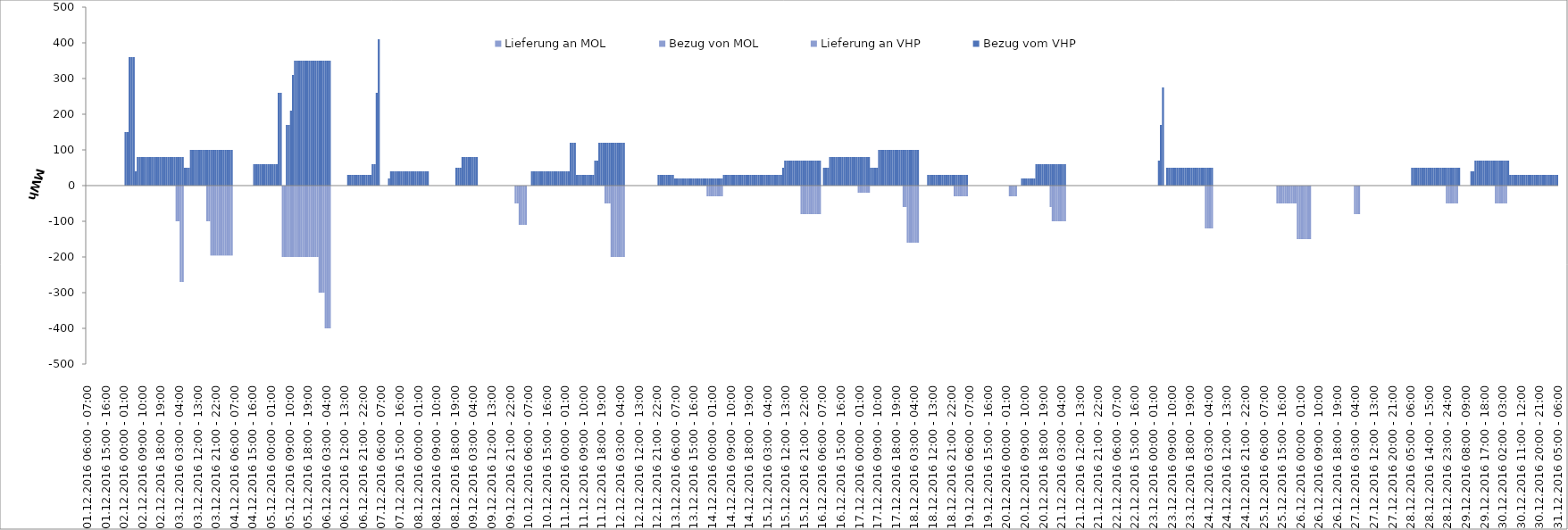
| Category | Bezug vom VHP | Lieferung an VHP | Bezug von MOL | Lieferung an MOL |
|---|---|---|---|---|
| 01.12.2016 06:00 - 07:00 | 0 | 0 | 0 | 0 |
| 01.12.2016 07:00 - 08:00 | 0 | 0 | 0 | 0 |
| 01.12.2016 08:00 - 09:00 | 0 | 0 | 0 | 0 |
| 01.12.2016 09:00 - 10:00 | 0 | 0 | 0 | 0 |
| 01.12.2016 10:00 - 11:00 | 0 | 0 | 0 | 0 |
| 01.12.2016 11:00 - 12:00 | 0 | 0 | 0 | 0 |
| 01.12.2016 12:00 - 13:00 | 0 | 0 | 0 | 0 |
| 01.12.2016 13:00 - 14:00 | 0 | 0 | 0 | 0 |
| 01.12.2016 14:00 - 15:00 | 0 | 0 | 0 | 0 |
| 01.12.2016 15:00 - 16:00 | 0 | 0 | 0 | 0 |
| 01.12.2016 16:00 - 17:00 | 0 | 0 | 0 | 0 |
| 01.12.2016 17:00 - 18:00 | 0 | 0 | 0 | 0 |
| 01.12.2016 18:00 - 19:00 | 0 | 0 | 0 | 0 |
| 01.12.2016 19:00 - 20:00 | 0 | 0 | 0 | 0 |
| 01.12.2016 20:00 - 21:00 | 0 | 0 | 0 | 0 |
| 01.12.2016 21:00 - 22:00 | 0 | 0 | 0 | 0 |
| 01.12.2016 22:00 - 23:00 | 0 | 0 | 0 | 0 |
| 01.12.2016 23:00 - 24:00 | 0 | 0 | 0 | 0 |
| 02.12.2016 00:00 - 01:00 | 0 | 0 | 0 | 0 |
| 02.12.2016 01:00 - 02:00 | 150 | 0 | 0 | 0 |
| 02.12.2016 02:00 - 03:00 | 150 | 0 | 0 | 0 |
| 02.12.2016 03:00 - 04:00 | 360 | 0 | 0 | 0 |
| 02.12.2016 04:00 - 05:00 | 360 | 0 | 0 | 0 |
| 02.12.2016 05:00 - 06:00 | 360 | 0 | 0 | 0 |
| 02.12.2016 06:00 - 07:00 | 40 | 0 | 0 | 0 |
| 02.12.2016 07:00 - 08:00 | 80 | 0 | 0 | 0 |
| 02.12.2016 08:00 - 09:00 | 80 | 0 | 0 | 0 |
| 02.12.2016 09:00 - 10:00 | 80 | 0 | 0 | 0 |
| 02.12.2016 10:00 - 11:00 | 80 | 0 | 0 | 0 |
| 02.12.2016 11:00 - 12:00 | 80 | 0 | 0 | 0 |
| 02.12.2016 12:00 - 13:00 | 80 | 0 | 0 | 0 |
| 02.12.2016 13:00 - 14:00 | 80 | 0 | 0 | 0 |
| 02.12.2016 14:00 - 15:00 | 80 | 0 | 0 | 0 |
| 02.12.2016 15:00 - 16:00 | 80 | 0 | 0 | 0 |
| 02.12.2016 16:00 - 17:00 | 80 | 0 | 0 | 0 |
| 02.12.2016 17:00 - 18:00 | 80 | 0 | 0 | 0 |
| 02.12.2016 18:00 - 19:00 | 80 | 0 | 0 | 0 |
| 02.12.2016 19:00 - 20:00 | 80 | 0 | 0 | 0 |
| 02.12.2016 20:00 - 21:00 | 80 | 0 | 0 | 0 |
| 02.12.2016 21:00 - 22:00 | 80 | 0 | 0 | 0 |
| 02.12.2016 22:00 - 23:00 | 80 | 0 | 0 | 0 |
| 02.12.2016 23:00 - 24:00 | 80 | 0 | 0 | 0 |
| 03.12.2016 00:00 - 01:00 | 80 | 0 | 0 | 0 |
| 03.12.2016 01:00 - 02:00 | 80 | 0 | 0 | 0 |
| 03.12.2016 02:00 - 03:00 | 80 | -100 | 0 | 0 |
| 03.12.2016 03:00 - 04:00 | 80 | -100 | 0 | 0 |
| 03.12.2016 04:00 - 05:00 | 80 | -270 | 0 | 0 |
| 03.12.2016 05:00 - 06:00 | 80 | -270 | 0 | 0 |
| 03.12.2016 06:00 - 07:00 | 50 | 0 | 0 | 0 |
| 03.12.2016 07:00 - 08:00 | 50 | 0 | 0 | 0 |
| 03.12.2016 08:00 - 09:00 | 50 | 0 | 0 | 0 |
| 03.12.2016 09:00 - 10:00 | 100 | 0 | 0 | 0 |
| 03.12.2016 10:00 - 11:00 | 100 | 0 | 0 | 0 |
| 03.12.2016 11:00 - 12:00 | 100 | 0 | 0 | 0 |
| 03.12.2016 12:00 - 13:00 | 100 | 0 | 0 | 0 |
| 03.12.2016 13:00 - 14:00 | 100 | 0 | 0 | 0 |
| 03.12.2016 14:00 - 15:00 | 100 | 0 | 0 | 0 |
| 03.12.2016 15:00 - 16:00 | 100 | 0 | 0 | 0 |
| 03.12.2016 16:00 - 17:00 | 100 | 0 | 0 | 0 |
| 03.12.2016 17:00 - 18:00 | 100 | -100 | 0 | 0 |
| 03.12.2016 18:00 - 19:00 | 100 | -100 | 0 | 0 |
| 03.12.2016 19:00 - 20:00 | 100 | -196 | 0 | 0 |
| 03.12.2016 20:00 - 21:00 | 100 | -196 | 0 | 0 |
| 03.12.2016 21:00 - 22:00 | 100 | -196 | 0 | 0 |
| 03.12.2016 22:00 - 23:00 | 100 | -196 | 0 | 0 |
| 03.12.2016 23:00 - 24:00 | 100 | -196 | 0 | 0 |
| 04.12.2016 00:00 - 01:00 | 100 | -196 | 0 | 0 |
| 04.12.2016 01:00 - 02:00 | 100 | -196 | 0 | 0 |
| 04.12.2016 02:00 - 03:00 | 100 | -196 | 0 | 0 |
| 04.12.2016 03:00 - 04:00 | 100 | -196 | 0 | 0 |
| 04.12.2016 04:00 - 05:00 | 100 | -196 | 0 | 0 |
| 04.12.2016 05:00 - 06:00 | 100 | -196 | 0 | 0 |
| 04.12.2016 06:00 - 07:00 | 0 | 0 | 0 | 0 |
| 04.12.2016 07:00 - 08:00 | 0 | 0 | 0 | 0 |
| 04.12.2016 08:00 - 09:00 | 0 | 0 | 0 | 0 |
| 04.12.2016 09:00 - 10:00 | 0 | 0 | 0 | 0 |
| 04.12.2016 10:00 - 11:00 | 0 | 0 | 0 | 0 |
| 04.12.2016 11:00 - 12:00 | 0 | 0 | 0 | 0 |
| 04.12.2016 12:00 - 13:00 | 0 | 0 | 0 | 0 |
| 04.12.2016 13:00 - 14:00 | 0 | 0 | 0 | 0 |
| 04.12.2016 14:00 - 15:00 | 0 | 0 | 0 | 0 |
| 04.12.2016 15:00 - 16:00 | 0 | 0 | 0 | 0 |
| 04.12.2016 16:00 - 17:00 | 60 | 0 | 0 | 0 |
| 04.12.2016 17:00 - 18:00 | 60 | 0 | 0 | 0 |
| 04.12.2016 18:00 - 19:00 | 60 | 0 | 0 | 0 |
| 04.12.2016 19:00 - 20:00 | 60 | 0 | 0 | 0 |
| 04.12.2016 20:00 - 21:00 | 60 | 0 | 0 | 0 |
| 04.12.2016 21:00 - 22:00 | 60 | 0 | 0 | 0 |
| 04.12.2016 22:00 - 23:00 | 60 | 0 | 0 | 0 |
| 04.12.2016 23:00 - 24:00 | 60 | 0 | 0 | 0 |
| 05.12.2016 00:00 - 01:00 | 60 | 0 | 0 | 0 |
| 05.12.2016 01:00 - 02:00 | 60 | 0 | 0 | 0 |
| 05.12.2016 02:00 - 03:00 | 60 | 0 | 0 | 0 |
| 05.12.2016 03:00 - 04:00 | 60 | 0 | 0 | 0 |
| 05.12.2016 04:00 - 05:00 | 260 | 0 | 0 | 0 |
| 05.12.2016 05:00 - 06:00 | 260 | 0 | 0 | 0 |
| 05.12.2016 06:00 - 07:00 | 0 | -200 | 0 | 0 |
| 05.12.2016 07:00 - 08:00 | 0 | -200 | 0 | 0 |
| 05.12.2016 08:00 - 09:00 | 170 | -200 | 0 | 0 |
| 05.12.2016 09:00 - 10:00 | 170 | -200 | 0 | 0 |
| 05.12.2016 10:00 - 11:00 | 210 | -200 | 0 | 0 |
| 05.12.2016 11:00 - 12:00 | 310 | -200 | 0 | 0 |
| 05.12.2016 12:00 - 13:00 | 350 | -200 | 0 | 0 |
| 05.12.2016 13:00 - 14:00 | 350 | -200 | 0 | 0 |
| 05.12.2016 14:00 - 15:00 | 350 | -200 | 0 | 0 |
| 05.12.2016 15:00 - 16:00 | 350 | -200 | 0 | 0 |
| 05.12.2016 16:00 - 17:00 | 350 | -200 | 0 | 0 |
| 05.12.2016 17:00 - 18:00 | 350 | -200 | 0 | 0 |
| 05.12.2016 18:00 - 19:00 | 350 | -200 | 0 | 0 |
| 05.12.2016 19:00 - 20:00 | 350 | -200 | 0 | 0 |
| 05.12.2016 20:00 - 21:00 | 350 | -200 | 0 | 0 |
| 05.12.2016 21:00 - 22:00 | 350 | -200 | 0 | 0 |
| 05.12.2016 22:00 - 23:00 | 350 | -200 | 0 | 0 |
| 05.12.2016 23:00 - 24:00 | 350 | -200 | 0 | 0 |
| 06.12.2016 00:00 - 01:00 | 350 | -300 | 0 | 0 |
| 06.12.2016 01:00 - 02:00 | 350 | -300 | 0 | 0 |
| 06.12.2016 02:00 - 03:00 | 350 | -300 | 0 | 0 |
| 06.12.2016 03:00 - 04:00 | 350 | -400 | 0 | 0 |
| 06.12.2016 04:00 - 05:00 | 350 | -400 | 0 | 0 |
| 06.12.2016 05:00 - 06:00 | 350 | -400 | 0 | 0 |
| 06.12.2016 06:00 - 07:00 | 0 | 0 | 0 | 0 |
| 06.12.2016 07:00 - 08:00 | 0 | 0 | 0 | 0 |
| 06.12.2016 08:00 - 09:00 | 0 | 0 | 0 | 0 |
| 06.12.2016 09:00 - 10:00 | 0 | 0 | 0 | 0 |
| 06.12.2016 10:00 - 11:00 | 0 | 0 | 0 | 0 |
| 06.12.2016 11:00 - 12:00 | 0 | 0 | 0 | 0 |
| 06.12.2016 12:00 - 13:00 | 0 | 0 | 0 | 0 |
| 06.12.2016 13:00 - 14:00 | 0 | 0 | 0 | 0 |
| 06.12.2016 14:00 - 15:00 | 30 | 0 | 0 | 0 |
| 06.12.2016 15:00 - 16:00 | 30 | 0 | 0 | 0 |
| 06.12.2016 16:00 - 17:00 | 30 | 0 | 0 | 0 |
| 06.12.2016 17:00 - 18:00 | 30 | 0 | 0 | 0 |
| 06.12.2016 18:00 - 19:00 | 30 | 0 | 0 | 0 |
| 06.12.2016 19:00 - 20:00 | 30 | 0 | 0 | 0 |
| 06.12.2016 20:00 - 21:00 | 30 | 0 | 0 | 0 |
| 06.12.2016 21:00 - 22:00 | 30 | 0 | 0 | 0 |
| 06.12.2016 22:00 - 23:00 | 30 | 0 | 0 | 0 |
| 06.12.2016 23:00 - 24:00 | 30 | 0 | 0 | 0 |
| 07.12.2016 00:00 - 01:00 | 30 | 0 | 0 | 0 |
| 07.12.2016 01:00 - 02:00 | 30 | 0 | 0 | 0 |
| 07.12.2016 02:00 - 03:00 | 60 | 0 | 0 | 0 |
| 07.12.2016 03:00 - 04:00 | 60 | 0 | 0 | 0 |
| 07.12.2016 04:00 - 05:00 | 260 | 0 | 0 | 0 |
| 07.12.2016 05:00 - 06:00 | 410 | 0 | 0 | 0 |
| 07.12.2016 06:00 - 07:00 | 0 | 0 | 0 | 0 |
| 07.12.2016 07:00 - 08:00 | 0 | 0 | 0 | 0 |
| 07.12.2016 08:00 - 09:00 | 0 | 0 | 0 | 0 |
| 07.12.2016 09:00 - 10:00 | 0 | 0 | 0 | 0 |
| 07.12.2016 10:00 - 11:00 | 20 | 0 | 0 | 0 |
| 07.12.2016 11:00 - 12:00 | 40 | 0 | 0 | 0 |
| 07.12.2016 12:00 - 13:00 | 40 | 0 | 0 | 0 |
| 07.12.2016 13:00 - 14:00 | 40 | 0 | 0 | 0 |
| 07.12.2016 14:00 - 15:00 | 40 | 0 | 0 | 0 |
| 07.12.2016 15:00 - 16:00 | 40 | 0 | 0 | 0 |
| 07.12.2016 16:00 - 17:00 | 40 | 0 | 0 | 0 |
| 07.12.2016 17:00 - 18:00 | 40 | 0 | 0 | 0 |
| 07.12.2016 18:00 - 19:00 | 40 | 0 | 0 | 0 |
| 07.12.2016 19:00 - 20:00 | 40 | 0 | 0 | 0 |
| 07.12.2016 20:00 - 21:00 | 40 | 0 | 0 | 0 |
| 07.12.2016 21:00 - 22:00 | 40 | 0 | 0 | 0 |
| 07.12.2016 22:00 - 23:00 | 40 | 0 | 0 | 0 |
| 07.12.2016 23:00 - 24:00 | 40 | 0 | 0 | 0 |
| 08.12.2016 00:00 - 01:00 | 40 | 0 | 0 | 0 |
| 08.12.2016 01:00 - 02:00 | 40 | 0 | 0 | 0 |
| 08.12.2016 02:00 - 03:00 | 40 | 0 | 0 | 0 |
| 08.12.2016 03:00 - 04:00 | 40 | 0 | 0 | 0 |
| 08.12.2016 04:00 - 05:00 | 40 | 0 | 0 | 0 |
| 08.12.2016 05:00 - 06:00 | 40 | 0 | 0 | 0 |
| 08.12.2016 06:00 - 07:00 | 0 | 0 | 0 | 0 |
| 08.12.2016 07:00 - 08:00 | 0 | 0 | 0 | 0 |
| 08.12.2016 08:00 - 09:00 | 0 | 0 | 0 | 0 |
| 08.12.2016 09:00 - 10:00 | 0 | 0 | 0 | 0 |
| 08.12.2016 10:00 - 11:00 | 0 | 0 | 0 | 0 |
| 08.12.2016 11:00 - 12:00 | 0 | 0 | 0 | 0 |
| 08.12.2016 12:00 - 13:00 | 0 | 0 | 0 | 0 |
| 08.12.2016 13:00 - 14:00 | 0 | 0 | 0 | 0 |
| 08.12.2016 14:00 - 15:00 | 0 | 0 | 0 | 0 |
| 08.12.2016 15:00 - 16:00 | 0 | 0 | 0 | 0 |
| 08.12.2016 16:00 - 17:00 | 0 | 0 | 0 | 0 |
| 08.12.2016 17:00 - 18:00 | 0 | 0 | 0 | 0 |
| 08.12.2016 18:00 - 19:00 | 0 | 0 | 0 | 0 |
| 08.12.2016 19:00 - 20:00 | 50 | 0 | 0 | 0 |
| 08.12.2016 20:00 - 21:00 | 50 | 0 | 0 | 0 |
| 08.12.2016 21:00 - 22:00 | 50 | 0 | 0 | 0 |
| 08.12.2016 22:00 - 23:00 | 80 | 0 | 0 | 0 |
| 08.12.2016 23:00 - 24:00 | 80 | 0 | 0 | 0 |
| 09.12.2016 00:00 - 01:00 | 80 | 0 | 0 | 0 |
| 09.12.2016 01:00 - 02:00 | 80 | 0 | 0 | 0 |
| 09.12.2016 02:00 - 03:00 | 80 | 0 | 0 | 0 |
| 09.12.2016 03:00 - 04:00 | 80 | 0 | 0 | 0 |
| 09.12.2016 04:00 - 05:00 | 80 | 0 | 0 | 0 |
| 09.12.2016 05:00 - 06:00 | 80 | 0 | 0 | 0 |
| 09.12.2016 06:00 - 07:00 | 0 | 0 | 0 | 0 |
| 09.12.2016 07:00 - 08:00 | 0 | 0 | 0 | 0 |
| 09.12.2016 08:00 - 09:00 | 0 | 0 | 0 | 0 |
| 09.12.2016 09:00 - 10:00 | 0 | 0 | 0 | 0 |
| 09.12.2016 10:00 - 11:00 | 0 | 0 | 0 | 0 |
| 09.12.2016 11:00 - 12:00 | 0 | 0 | 0 | 0 |
| 09.12.2016 12:00 - 13:00 | 0 | 0 | 0 | 0 |
| 09.12.2016 13:00 - 14:00 | 0 | 0 | 0 | 0 |
| 09.12.2016 14:00 - 15:00 | 0 | 0 | 0 | 0 |
| 09.12.2016 15:00 - 16:00 | 0 | 0 | 0 | 0 |
| 09.12.2016 16:00 - 17:00 | 0 | 0 | 0 | 0 |
| 09.12.2016 17:00 - 18:00 | 0 | 0 | 0 | 0 |
| 09.12.2016 18:00 - 19:00 | 0 | 0 | 0 | 0 |
| 09.12.2016 19:00 - 20:00 | 0 | 0 | 0 | 0 |
| 09.12.2016 20:00 - 21:00 | 0 | 0 | 0 | 0 |
| 09.12.2016 21:00 - 22:00 | 0 | 0 | 0 | 0 |
| 09.12.2016 22:00 - 23:00 | 0 | 0 | 0 | 0 |
| 09.12.2016 23:00 - 24:00 | 0 | 0 | 0 | 0 |
| 10.12.2016 00:00 - 01:00 | 0 | -50 | 0 | 0 |
| 10.12.2016 01:00 - 02:00 | 0 | -50 | 0 | 0 |
| 10.12.2016 02:00 - 03:00 | 0 | -110 | 0 | 0 |
| 10.12.2016 03:00 - 04:00 | 0 | -110 | 0 | 0 |
| 10.12.2016 04:00 - 05:00 | 0 | -110 | 0 | 0 |
| 10.12.2016 05:00 - 06:00 | 0 | -110 | 0 | 0 |
| 10.12.2016 06:00 - 07:00 | 0 | 0 | 0 | 0 |
| 10.12.2016 07:00 - 08:00 | 0 | 0 | 0 | 0 |
| 10.12.2016 08:00 - 09:00 | 40 | 0 | 0 | 0 |
| 10.12.2016 09:00 - 10:00 | 40 | 0 | 0 | 0 |
| 10.12.2016 10:00 - 11:00 | 40 | 0 | 0 | 0 |
| 10.12.2016 11:00 - 12:00 | 40 | 0 | 0 | 0 |
| 10.12.2016 12:00 - 13:00 | 40 | 0 | 0 | 0 |
| 10.12.2016 13:00 - 14:00 | 40 | 0 | 0 | 0 |
| 10.12.2016 14:00 - 15:00 | 40 | 0 | 0 | 0 |
| 10.12.2016 15:00 - 16:00 | 40 | 0 | 0 | 0 |
| 10.12.2016 16:00 - 17:00 | 40 | 0 | 0 | 0 |
| 10.12.2016 17:00 - 18:00 | 40 | 0 | 0 | 0 |
| 10.12.2016 18:00 - 19:00 | 40 | 0 | 0 | 0 |
| 10.12.2016 19:00 - 20:00 | 40 | 0 | 0 | 0 |
| 10.12.2016 20:00 - 21:00 | 40 | 0 | 0 | 0 |
| 10.12.2016 21:00 - 22:00 | 40 | 0 | 0 | 0 |
| 10.12.2016 22:00 - 23:00 | 40 | 0 | 0 | 0 |
| 10.12.2016 23:00 - 24:00 | 40 | 0 | 0 | 0 |
| 11.12.2016 00:00 - 01:00 | 40 | 0 | 0 | 0 |
| 11.12.2016 01:00 - 02:00 | 40 | 0 | 0 | 0 |
| 11.12.2016 02:00 - 03:00 | 40 | 0 | 0 | 0 |
| 11.12.2016 03:00 - 04:00 | 120 | 0 | 0 | 0 |
| 11.12.2016 04:00 - 05:00 | 120 | 0 | 0 | 0 |
| 11.12.2016 05:00 - 06:00 | 120 | 0 | 0 | 0 |
| 11.12.2016 06:00 - 07:00 | 30 | 0 | 0 | 0 |
| 11.12.2016 07:00 - 08:00 | 30 | 0 | 0 | 0 |
| 11.12.2016 08:00 - 09:00 | 30 | 0 | 0 | 0 |
| 11.12.2016 09:00 - 10:00 | 30 | 0 | 0 | 0 |
| 11.12.2016 10:00 - 11:00 | 30 | 0 | 0 | 0 |
| 11.12.2016 11:00 - 12:00 | 30 | 0 | 0 | 0 |
| 11.12.2016 12:00 - 13:00 | 30 | 0 | 0 | 0 |
| 11.12.2016 13:00 - 14:00 | 30 | 0 | 0 | 0 |
| 11.12.2016 14:00 - 15:00 | 30 | 0 | 0 | 0 |
| 11.12.2016 15:00 - 16:00 | 70 | 0 | 0 | 0 |
| 11.12.2016 16:00 - 17:00 | 70 | 0 | 0 | 0 |
| 11.12.2016 17:00 - 18:00 | 120 | 0 | 0 | 0 |
| 11.12.2016 18:00 - 19:00 | 120 | 0 | 0 | 0 |
| 11.12.2016 19:00 - 20:00 | 120 | 0 | 0 | 0 |
| 11.12.2016 20:00 - 21:00 | 120 | -50 | 0 | 0 |
| 11.12.2016 21:00 - 22:00 | 120 | -50 | 0 | 0 |
| 11.12.2016 22:00 - 23:00 | 120 | -50 | 0 | 0 |
| 11.12.2016 23:00 - 24:00 | 120 | -200 | 0 | 0 |
| 12.12.2016 00:00 - 01:00 | 120 | -200 | 0 | 0 |
| 12.12.2016 01:00 - 02:00 | 120 | -200 | 0 | 0 |
| 12.12.2016 02:00 - 03:00 | 120 | -200 | 0 | 0 |
| 12.12.2016 03:00 - 04:00 | 120 | -200 | 0 | 0 |
| 12.12.2016 04:00 - 05:00 | 120 | -200 | 0 | 0 |
| 12.12.2016 05:00 - 06:00 | 120 | -200 | 0 | 0 |
| 12.12.2016 06:00 - 07:00 | 0 | 0 | 0 | 0 |
| 12.12.2016 07:00 - 08:00 | 0 | 0 | 0 | 0 |
| 12.12.2016 08:00 - 09:00 | 0 | 0 | 0 | 0 |
| 12.12.2016 09:00 - 10:00 | 0 | 0 | 0 | 0 |
| 12.12.2016 10:00 - 11:00 | 0 | 0 | 0 | 0 |
| 12.12.2016 11:00 - 12:00 | 0 | 0 | 0 | 0 |
| 12.12.2016 12:00 - 13:00 | 0 | 0 | 0 | 0 |
| 12.12.2016 13:00 - 14:00 | 0 | 0 | 0 | 0 |
| 12.12.2016 14:00 - 15:00 | 0 | 0 | 0 | 0 |
| 12.12.2016 15:00 - 16:00 | 0 | 0 | 0 | 0 |
| 12.12.2016 16:00 - 17:00 | 0 | 0 | 0 | 0 |
| 12.12.2016 17:00 - 18:00 | 0 | 0 | 0 | 0 |
| 12.12.2016 18:00 - 19:00 | 0 | 0 | 0 | 0 |
| 12.12.2016 19:00 - 20:00 | 0 | 0 | 0 | 0 |
| 12.12.2016 20:00 - 21:00 | 0 | 0 | 0 | 0 |
| 12.12.2016 21:00 - 22:00 | 0 | 0 | 0 | 0 |
| 12.12.2016 22:00 - 23:00 | 30 | 0 | 0 | 0 |
| 12.12.2016 23:00 - 24:00 | 30 | 0 | 0 | 0 |
| 13.12.2016 00:00 - 01:00 | 30 | 0 | 0 | 0 |
| 13.12.2016 01:00 - 02:00 | 30 | 0 | 0 | 0 |
| 13.12.2016 02:00 - 03:00 | 30 | 0 | 0 | 0 |
| 13.12.2016 03:00 - 04:00 | 30 | 0 | 0 | 0 |
| 13.12.2016 04:00 - 05:00 | 30 | 0 | 0 | 0 |
| 13.12.2016 05:00 - 06:00 | 30 | 0 | 0 | 0 |
| 13.12.2016 06:00 - 07:00 | 20 | 0 | 0 | 0 |
| 13.12.2016 07:00 - 08:00 | 20 | 0 | 0 | 0 |
| 13.12.2016 08:00 - 09:00 | 20 | 0 | 0 | 0 |
| 13.12.2016 09:00 - 10:00 | 20 | 0 | 0 | 0 |
| 13.12.2016 10:00 - 11:00 | 20 | 0 | 0 | 0 |
| 13.12.2016 11:00 - 12:00 | 20 | 0 | 0 | 0 |
| 13.12.2016 12:00 - 13:00 | 20 | 0 | 0 | 0 |
| 13.12.2016 13:00 - 14:00 | 20 | 0 | 0 | 0 |
| 13.12.2016 14:00 - 15:00 | 20 | 0 | 0 | 0 |
| 13.12.2016 15:00 - 16:00 | 20 | 0 | 0 | 0 |
| 13.12.2016 16:00 - 17:00 | 20 | 0 | 0 | 0 |
| 13.12.2016 17:00 - 18:00 | 20 | 0 | 0 | 0 |
| 13.12.2016 18:00 - 19:00 | 20 | 0 | 0 | 0 |
| 13.12.2016 19:00 - 20:00 | 20 | 0 | 0 | 0 |
| 13.12.2016 20:00 - 21:00 | 20 | 0 | 0 | 0 |
| 13.12.2016 21:00 - 22:00 | 20 | 0 | 0 | 0 |
| 13.12.2016 22:00 - 23:00 | 20 | -30 | 0 | 0 |
| 13.12.2016 23:00 - 24:00 | 20 | -30 | 0 | 0 |
| 14.12.2016 00:00 - 01:00 | 20 | -30 | 0 | 0 |
| 14.12.2016 01:00 - 02:00 | 20 | -30 | 0 | 0 |
| 14.12.2016 02:00 - 03:00 | 20 | -30 | 0 | 0 |
| 14.12.2016 03:00 - 04:00 | 20 | -30 | 0 | 0 |
| 14.12.2016 04:00 - 05:00 | 20 | -30 | 0 | 0 |
| 14.12.2016 05:00 - 06:00 | 20 | -30 | 0 | 0 |
| 14.12.2016 06:00 - 07:00 | 30 | 0 | 0 | 0 |
| 14.12.2016 07:00 - 08:00 | 30 | 0 | 0 | 0 |
| 14.12.2016 08:00 - 09:00 | 30 | 0 | 0 | 0 |
| 14.12.2016 09:00 - 10:00 | 30 | 0 | 0 | 0 |
| 14.12.2016 10:00 - 11:00 | 30 | 0 | 0 | 0 |
| 14.12.2016 11:00 - 12:00 | 30 | 0 | 0 | 0 |
| 14.12.2016 12:00 - 13:00 | 30 | 0 | 0 | 0 |
| 14.12.2016 13:00 - 14:00 | 30 | 0 | 0 | 0 |
| 14.12.2016 14:00 - 15:00 | 30 | 0 | 0 | 0 |
| 14.12.2016 15:00 - 16:00 | 30 | 0 | 0 | 0 |
| 14.12.2016 16:00 - 17:00 | 30 | 0 | 0 | 0 |
| 14.12.2016 17:00 - 18:00 | 30 | 0 | 0 | 0 |
| 14.12.2016 18:00 - 19:00 | 30 | 0 | 0 | 0 |
| 14.12.2016 19:00 - 20:00 | 30 | 0 | 0 | 0 |
| 14.12.2016 20:00 - 21:00 | 30 | 0 | 0 | 0 |
| 14.12.2016 21:00 - 22:00 | 30 | 0 | 0 | 0 |
| 14.12.2016 22:00 - 23:00 | 30 | 0 | 0 | 0 |
| 14.12.2016 23:00 - 24:00 | 30 | 0 | 0 | 0 |
| 15.12.2016 00:00 - 01:00 | 30 | 0 | 0 | 0 |
| 15.12.2016 01:00 - 02:00 | 30 | 0 | 0 | 0 |
| 15.12.2016 02:00 - 03:00 | 30 | 0 | 0 | 0 |
| 15.12.2016 03:00 - 04:00 | 30 | 0 | 0 | 0 |
| 15.12.2016 04:00 - 05:00 | 30 | 0 | 0 | 0 |
| 15.12.2016 05:00 - 06:00 | 30 | 0 | 0 | 0 |
| 15.12.2016 06:00 - 07:00 | 30 | 0 | 0 | 0 |
| 15.12.2016 07:00 - 08:00 | 30 | 0 | 0 | 0 |
| 15.12.2016 08:00 - 09:00 | 30 | 0 | 0 | 0 |
| 15.12.2016 09:00 - 10:00 | 30 | 0 | 0 | 0 |
| 15.12.2016 10:00 - 11:00 | 30 | 0 | 0 | 0 |
| 15.12.2016 11:00 - 12:00 | 50 | 0 | 0 | 0 |
| 15.12.2016 12:00 - 13:00 | 70 | 0 | 0 | 0 |
| 15.12.2016 13:00 - 14:00 | 70 | 0 | 0 | 0 |
| 15.12.2016 14:00 - 15:00 | 70 | 0 | 0 | 0 |
| 15.12.2016 15:00 - 16:00 | 70 | 0 | 0 | 0 |
| 15.12.2016 16:00 - 17:00 | 70 | 0 | 0 | 0 |
| 15.12.2016 17:00 - 18:00 | 70 | 0 | 0 | 0 |
| 15.12.2016 18:00 - 19:00 | 70 | 0 | 0 | 0 |
| 15.12.2016 19:00 - 20:00 | 70 | 0 | 0 | 0 |
| 15.12.2016 20:00 - 21:00 | 70 | -80 | 0 | 0 |
| 15.12.2016 21:00 - 22:00 | 70 | -80 | 0 | 0 |
| 15.12.2016 22:00 - 23:00 | 70 | -80 | 0 | 0 |
| 15.12.2016 23:00 - 24:00 | 70 | -80 | 0 | 0 |
| 16.12.2016 00:00 - 01:00 | 70 | -80 | 0 | 0 |
| 16.12.2016 01:00 - 02:00 | 70 | -80 | 0 | 0 |
| 16.12.2016 02:00 - 03:00 | 70 | -80 | 0 | 0 |
| 16.12.2016 03:00 - 04:00 | 70 | -80 | 0 | 0 |
| 16.12.2016 04:00 - 05:00 | 70 | -80 | 0 | 0 |
| 16.12.2016 05:00 - 06:00 | 70 | -80 | 0 | 0 |
| 16.12.2016 06:00 - 07:00 | 0 | 0 | 0 | 0 |
| 16.12.2016 07:00 - 08:00 | 50 | 0 | 0 | 0 |
| 16.12.2016 08:00 - 09:00 | 50 | 0 | 0 | 0 |
| 16.12.2016 09:00 - 10:00 | 50 | 0 | 0 | 0 |
| 16.12.2016 10:00 - 11:00 | 80 | 0 | 0 | 0 |
| 16.12.2016 11:00 - 12:00 | 80 | 0 | 0 | 0 |
| 16.12.2016 12:00 - 13:00 | 80 | 0 | 0 | 0 |
| 16.12.2016 13:00 - 14:00 | 80 | 0 | 0 | 0 |
| 16.12.2016 14:00 - 15:00 | 80 | 0 | 0 | 0 |
| 16.12.2016 15:00 - 16:00 | 80 | 0 | 0 | 0 |
| 16.12.2016 16:00 - 17:00 | 80 | 0 | 0 | 0 |
| 16.12.2016 17:00 - 18:00 | 80 | 0 | 0 | 0 |
| 16.12.2016 18:00 - 19:00 | 80 | 0 | 0 | 0 |
| 16.12.2016 19:00 - 20:00 | 80 | 0 | 0 | 0 |
| 16.12.2016 20:00 - 21:00 | 80 | 0 | 0 | 0 |
| 16.12.2016 21:00 - 22:00 | 80 | 0 | 0 | 0 |
| 16.12.2016 22:00 - 23:00 | 80 | 0 | 0 | 0 |
| 16.12.2016 23:00 - 24:00 | 80 | 0 | 0 | 0 |
| 17.12.2016 00:00 - 01:00 | 80 | -20 | 0 | 0 |
| 17.12.2016 01:00 - 02:00 | 80 | -20 | 0 | 0 |
| 17.12.2016 02:00 - 03:00 | 80 | -20 | 0 | 0 |
| 17.12.2016 03:00 - 04:00 | 80 | -20 | 0 | 0 |
| 17.12.2016 04:00 - 05:00 | 80 | -20 | 0 | 0 |
| 17.12.2016 05:00 - 06:00 | 80 | -20 | 0 | 0 |
| 17.12.2016 06:00 - 07:00 | 50 | 0 | 0 | 0 |
| 17.12.2016 07:00 - 08:00 | 50 | 0 | 0 | 0 |
| 17.12.2016 08:00 - 09:00 | 50 | 0 | 0 | 0 |
| 17.12.2016 09:00 - 10:00 | 50 | 0 | 0 | 0 |
| 17.12.2016 10:00 - 11:00 | 100 | 0 | 0 | 0 |
| 17.12.2016 11:00 - 12:00 | 100 | 0 | 0 | 0 |
| 17.12.2016 12:00 - 13:00 | 100 | 0 | 0 | 0 |
| 17.12.2016 13:00 - 14:00 | 100 | 0 | 0 | 0 |
| 17.12.2016 14:00 - 15:00 | 100 | 0 | 0 | 0 |
| 17.12.2016 15:00 - 16:00 | 100 | 0 | 0 | 0 |
| 17.12.2016 16:00 - 17:00 | 100 | 0 | 0 | 0 |
| 17.12.2016 17:00 - 18:00 | 100 | 0 | 0 | 0 |
| 17.12.2016 18:00 - 19:00 | 100 | 0 | 0 | 0 |
| 17.12.2016 19:00 - 20:00 | 100 | 0 | 0 | 0 |
| 17.12.2016 20:00 - 21:00 | 100 | 0 | 0 | 0 |
| 17.12.2016 21:00 - 22:00 | 100 | 0 | 0 | 0 |
| 17.12.2016 22:00 - 23:00 | 100 | -60 | 0 | 0 |
| 17.12.2016 23:00 - 24:00 | 100 | -60 | 0 | 0 |
| 18.12.2016 00:00 - 01:00 | 100 | -160 | 0 | 0 |
| 18.12.2016 01:00 - 02:00 | 100 | -160 | 0 | 0 |
| 18.12.2016 02:00 - 03:00 | 100 | -160 | 0 | 0 |
| 18.12.2016 03:00 - 04:00 | 100 | -160 | 0 | 0 |
| 18.12.2016 04:00 - 05:00 | 100 | -160 | 0 | 0 |
| 18.12.2016 05:00 - 06:00 | 100 | -160 | 0 | 0 |
| 18.12.2016 06:00 - 07:00 | 0 | 0 | 0 | 0 |
| 18.12.2016 07:00 - 08:00 | 0 | 0 | 0 | 0 |
| 18.12.2016 08:00 - 09:00 | 0 | 0 | 0 | 0 |
| 18.12.2016 09:00 - 10:00 | 0 | 0 | 0 | 0 |
| 18.12.2016 10:00 - 11:00 | 30 | 0 | 0 | 0 |
| 18.12.2016 11:00 - 12:00 | 30 | 0 | 0 | 0 |
| 18.12.2016 12:00 - 13:00 | 30 | 0 | 0 | 0 |
| 18.12.2016 13:00 - 14:00 | 30 | 0 | 0 | 0 |
| 18.12.2016 14:00 - 15:00 | 30 | 0 | 0 | 0 |
| 18.12.2016 15:00 - 16:00 | 30 | 0 | 0 | 0 |
| 18.12.2016 16:00 - 17:00 | 30 | 0 | 0 | 0 |
| 18.12.2016 17:00 - 18:00 | 30 | 0 | 0 | 0 |
| 18.12.2016 18:00 - 19:00 | 30 | 0 | 0 | 0 |
| 18.12.2016 19:00 - 20:00 | 30 | 0 | 0 | 0 |
| 18.12.2016 20:00 - 21:00 | 30 | 0 | 0 | 0 |
| 18.12.2016 21:00 - 22:00 | 30 | 0 | 0 | 0 |
| 18.12.2016 22:00 - 23:00 | 30 | 0 | 0 | 0 |
| 18.12.2016 23:00 - 24:00 | 30 | -30 | 0 | 0 |
| 19.12.2016 00:00 - 01:00 | 30 | -30 | 0 | 0 |
| 19.12.2016 01:00 - 02:00 | 30 | -30 | 0 | 0 |
| 19.12.2016 02:00 - 03:00 | 30 | -30 | 0 | 0 |
| 19.12.2016 03:00 - 04:00 | 30 | -30 | 0 | 0 |
| 19.12.2016 04:00 - 05:00 | 30 | -30 | 0 | 0 |
| 19.12.2016 05:00 - 06:00 | 30 | -30 | 0 | 0 |
| 19.12.2016 06:00 - 07:00 | 0 | 0 | 0 | 0 |
| 19.12.2016 07:00 - 08:00 | 0 | 0 | 0 | 0 |
| 19.12.2016 08:00 - 09:00 | 0 | 0 | 0 | 0 |
| 19.12.2016 09:00 - 10:00 | 0 | 0 | 0 | 0 |
| 19.12.2016 10:00 - 11:00 | 0 | 0 | 0 | 0 |
| 19.12.2016 11:00 - 12:00 | 0 | 0 | 0 | 0 |
| 19.12.2016 12:00 - 13:00 | 0 | 0 | 0 | 0 |
| 19.12.2016 13:00 - 14:00 | 0 | 0 | 0 | 0 |
| 19.12.2016 14:00 - 15:00 | 0 | 0 | 0 | 0 |
| 19.12.2016 15:00 - 16:00 | 0 | 0 | 0 | 0 |
| 19.12.2016 16:00 - 17:00 | 0 | 0 | 0 | 0 |
| 19.12.2016 17:00 - 18:00 | 0 | 0 | 0 | 0 |
| 19.12.2016 18:00 - 19:00 | 0 | 0 | 0 | 0 |
| 19.12.2016 19:00 - 20:00 | 0 | 0 | 0 | 0 |
| 19.12.2016 20:00 - 21:00 | 0 | 0 | 0 | 0 |
| 19.12.2016 21:00 - 22:00 | 0 | 0 | 0 | 0 |
| 19.12.2016 22:00 - 23:00 | 0 | 0 | 0 | 0 |
| 19.12.2016 23:00 - 24:00 | 0 | 0 | 0 | 0 |
| 20.12.2016 00:00 - 01:00 | 0 | 0 | 0 | 0 |
| 20.12.2016 01:00 - 02:00 | 0 | 0 | 0 | 0 |
| 20.12.2016 02:00 - 03:00 | 0 | -30 | 0 | 0 |
| 20.12.2016 03:00 - 04:00 | 0 | -30 | 0 | 0 |
| 20.12.2016 04:00 - 05:00 | 0 | -30 | 0 | 0 |
| 20.12.2016 05:00 - 06:00 | 0 | -30 | 0 | 0 |
| 20.12.2016 06:00 - 07:00 | 0 | 0 | 0 | 0 |
| 20.12.2016 07:00 - 08:00 | 0 | 0 | 0 | 0 |
| 20.12.2016 08:00 - 09:00 | 20 | 0 | 0 | 0 |
| 20.12.2016 09:00 - 10:00 | 20 | 0 | 0 | 0 |
| 20.12.2016 10:00 - 11:00 | 20 | 0 | 0 | 0 |
| 20.12.2016 11:00 - 12:00 | 20 | 0 | 0 | 0 |
| 20.12.2016 12:00 - 13:00 | 20 | 0 | 0 | 0 |
| 20.12.2016 13:00 - 14:00 | 20 | 0 | 0 | 0 |
| 20.12.2016 14:00 - 15:00 | 20 | 0 | 0 | 0 |
| 20.12.2016 15:00 - 16:00 | 60 | 0 | 0 | 0 |
| 20.12.2016 16:00 - 17:00 | 60 | 0 | 0 | 0 |
| 20.12.2016 17:00 - 18:00 | 60 | 0 | 0 | 0 |
| 20.12.2016 18:00 - 19:00 | 60 | 0 | 0 | 0 |
| 20.12.2016 19:00 - 20:00 | 60 | 0 | 0 | 0 |
| 20.12.2016 20:00 - 21:00 | 60 | 0 | 0 | 0 |
| 20.12.2016 21:00 - 22:00 | 60 | 0 | 0 | 0 |
| 20.12.2016 22:00 - 23:00 | 60 | -60 | 0 | 0 |
| 20.12.2016 23:00 - 24:00 | 60 | -100 | 0 | 0 |
| 21.12.2016 00:00 - 01:00 | 60 | -100 | 0 | 0 |
| 21.12.2016 01:00 - 02:00 | 60 | -100 | 0 | 0 |
| 21.12.2016 02:00 - 03:00 | 60 | -100 | 0 | 0 |
| 21.12.2016 03:00 - 04:00 | 60 | -100 | 0 | 0 |
| 21.12.2016 04:00 - 05:00 | 60 | -100 | 0 | 0 |
| 21.12.2016 05:00 - 06:00 | 60 | -100 | 0 | 0 |
| 21.12.2016 06:00 - 07:00 | 0 | 0 | 0 | 0 |
| 21.12.2016 07:00 - 08:00 | 0 | 0 | 0 | 0 |
| 21.12.2016 08:00 - 09:00 | 0 | 0 | 0 | 0 |
| 21.12.2016 09:00 - 10:00 | 0 | 0 | 0 | 0 |
| 21.12.2016 10:00 - 11:00 | 0 | 0 | 0 | 0 |
| 21.12.2016 11:00 - 12:00 | 0 | 0 | 0 | 0 |
| 21.12.2016 12:00 - 13:00 | 0 | 0 | 0 | 0 |
| 21.12.2016 13:00 - 14:00 | 0 | 0 | 0 | 0 |
| 21.12.2016 14:00 - 15:00 | 0 | 0 | 0 | 0 |
| 21.12.2016 15:00 - 16:00 | 0 | 0 | 0 | 0 |
| 21.12.2016 16:00 - 17:00 | 0 | 0 | 0 | 0 |
| 21.12.2016 17:00 - 18:00 | 0 | 0 | 0 | 0 |
| 21.12.2016 18:00 - 19:00 | 0 | 0 | 0 | 0 |
| 21.12.2016 19:00 - 20:00 | 0 | 0 | 0 | 0 |
| 21.12.2016 20:00 - 21:00 | 0 | 0 | 0 | 0 |
| 21.12.2016 21:00 - 22:00 | 0 | 0 | 0 | 0 |
| 21.12.2016 22:00 - 23:00 | 0 | 0 | 0 | 0 |
| 21.12.2016 23:00 - 24:00 | 0 | 0 | 0 | 0 |
| 22.12.2016 00:00 - 01:00 | 0 | 0 | 0 | 0 |
| 22.12.2016 01:00 - 02:00 | 0 | 0 | 0 | 0 |
| 22.12.2016 02:00 - 03:00 | 0 | 0 | 0 | 0 |
| 22.12.2016 03:00 - 04:00 | 0 | 0 | 0 | 0 |
| 22.12.2016 04:00 - 05:00 | 0 | 0 | 0 | 0 |
| 22.12.2016 05:00 - 06:00 | 0 | 0 | 0 | 0 |
| 22.12.2016 06:00 - 07:00 | 0 | 0 | 0 | 0 |
| 22.12.2016 07:00 - 08:00 | 0 | 0 | 0 | 0 |
| 22.12.2016 08:00 - 09:00 | 0 | 0 | 0 | 0 |
| 22.12.2016 09:00 - 10:00 | 0 | 0 | 0 | 0 |
| 22.12.2016 10:00 - 11:00 | 0 | 0 | 0 | 0 |
| 22.12.2016 11:00 - 12:00 | 0 | 0 | 0 | 0 |
| 22.12.2016 12:00 - 13:00 | 0 | 0 | 0 | 0 |
| 22.12.2016 13:00 - 14:00 | 0 | 0 | 0 | 0 |
| 22.12.2016 14:00 - 15:00 | 0 | 0 | 0 | 0 |
| 22.12.2016 15:00 - 16:00 | 0 | 0 | 0 | 0 |
| 22.12.2016 16:00 - 17:00 | 0 | 0 | 0 | 0 |
| 22.12.2016 17:00 - 18:00 | 0 | 0 | 0 | 0 |
| 22.12.2016 18:00 - 19:00 | 0 | 0 | 0 | 0 |
| 22.12.2016 19:00 - 20:00 | 0 | 0 | 0 | 0 |
| 22.12.2016 20:00 - 21:00 | 0 | 0 | 0 | 0 |
| 22.12.2016 21:00 - 22:00 | 0 | 0 | 0 | 0 |
| 22.12.2016 22:00 - 23:00 | 0 | 0 | 0 | 0 |
| 22.12.2016 23:00 - 24:00 | 0 | 0 | 0 | 0 |
| 23.12.2016 00:00 - 01:00 | 0 | 0 | 0 | 0 |
| 23.12.2016 01:00 - 02:00 | 0 | 0 | 0 | 0 |
| 23.12.2016 02:00 - 03:00 | 0 | 0 | 0 | 0 |
| 23.12.2016 03:00 - 04:00 | 70 | 0 | 0 | 0 |
| 23.12.2016 04:00 - 05:00 | 170 | 0 | 0 | 0 |
| 23.12.2016 05:00 - 06:00 | 275 | 0 | 0 | 0 |
| 23.12.2016 06:00 - 07:00 | 0 | 0 | 0 | 0 |
| 23.12.2016 07:00 - 08:00 | 50 | 0 | 0 | 0 |
| 23.12.2016 08:00 - 09:00 | 50 | 0 | 0 | 0 |
| 23.12.2016 09:00 - 10:00 | 50 | 0 | 0 | 0 |
| 23.12.2016 10:00 - 11:00 | 50 | 0 | 0 | 0 |
| 23.12.2016 11:00 - 12:00 | 50 | 0 | 0 | 0 |
| 23.12.2016 12:00 - 13:00 | 50 | 0 | 0 | 0 |
| 23.12.2016 13:00 - 14:00 | 50 | 0 | 0 | 0 |
| 23.12.2016 14:00 - 15:00 | 50 | 0 | 0 | 0 |
| 23.12.2016 15:00 - 16:00 | 50 | 0 | 0 | 0 |
| 23.12.2016 16:00 - 17:00 | 50 | 0 | 0 | 0 |
| 23.12.2016 17:00 - 18:00 | 50 | 0 | 0 | 0 |
| 23.12.2016 18:00 - 19:00 | 50 | 0 | 0 | 0 |
| 23.12.2016 19:00 - 20:00 | 50 | 0 | 0 | 0 |
| 23.12.2016 20:00 - 21:00 | 50 | 0 | 0 | 0 |
| 23.12.2016 21:00 - 22:00 | 50 | 0 | 0 | 0 |
| 23.12.2016 22:00 - 23:00 | 50 | 0 | 0 | 0 |
| 23.12.2016 23:00 - 24:00 | 50 | 0 | 0 | 0 |
| 24.12.2016 00:00 - 01:00 | 50 | 0 | 0 | 0 |
| 24.12.2016 01:00 - 02:00 | 50 | 0 | 0 | 0 |
| 24.12.2016 02:00 - 03:00 | 50 | -120 | 0 | 0 |
| 24.12.2016 03:00 - 04:00 | 50 | -120 | 0 | 0 |
| 24.12.2016 04:00 - 05:00 | 50 | -120 | 0 | 0 |
| 24.12.2016 05:00 - 06:00 | 50 | -120 | 0 | 0 |
| 24.12.2016 06:00 - 07:00 | 0 | 0 | 0 | 0 |
| 24.12.2016 07:00 - 08:00 | 0 | 0 | 0 | 0 |
| 24.12.2016 08:00 - 09:00 | 0 | 0 | 0 | 0 |
| 24.12.2016 09:00 - 10:00 | 0 | 0 | 0 | 0 |
| 24.12.2016 10:00 - 11:00 | 0 | 0 | 0 | 0 |
| 24.12.2016 11:00 - 12:00 | 0 | 0 | 0 | 0 |
| 24.12.2016 12:00 - 13:00 | 0 | 0 | 0 | 0 |
| 24.12.2016 13:00 - 14:00 | 0 | 0 | 0 | 0 |
| 24.12.2016 14:00 - 15:00 | 0 | 0 | 0 | 0 |
| 24.12.2016 15:00 - 16:00 | 0 | 0 | 0 | 0 |
| 24.12.2016 16:00 - 17:00 | 0 | 0 | 0 | 0 |
| 24.12.2016 17:00 - 18:00 | 0 | 0 | 0 | 0 |
| 24.12.2016 18:00 - 19:00 | 0 | 0 | 0 | 0 |
| 24.12.2016 19:00 - 20:00 | 0 | 0 | 0 | 0 |
| 24.12.2016 20:00 - 21:00 | 0 | 0 | 0 | 0 |
| 24.12.2016 21:00 - 22:00 | 0 | 0 | 0 | 0 |
| 24.12.2016 22:00 - 23:00 | 0 | 0 | 0 | 0 |
| 24.12.2016 23:00 - 24:00 | 0 | 0 | 0 | 0 |
| 25.12.2016 00:00 - 01:00 | 0 | 0 | 0 | 0 |
| 25.12.2016 01:00 - 02:00 | 0 | 0 | 0 | 0 |
| 25.12.2016 02:00 - 03:00 | 0 | 0 | 0 | 0 |
| 25.12.2016 03:00 - 04:00 | 0 | 0 | 0 | 0 |
| 25.12.2016 04:00 - 05:00 | 0 | 0 | 0 | 0 |
| 25.12.2016 05:00 - 06:00 | 0 | 0 | 0 | 0 |
| 25.12.2016 06:00 - 07:00 | 0 | 0 | 0 | 0 |
| 25.12.2016 07:00 - 08:00 | 0 | 0 | 0 | 0 |
| 25.12.2016 08:00 - 09:00 | 0 | 0 | 0 | 0 |
| 25.12.2016 09:00 - 10:00 | 0 | 0 | 0 | 0 |
| 25.12.2016 10:00 - 11:00 | 0 | 0 | 0 | 0 |
| 25.12.2016 11:00 - 12:00 | 0 | 0 | 0 | 0 |
| 25.12.2016 12:00 - 13:00 | 0 | 0 | 0 | 0 |
| 25.12.2016 13:00 - 14:00 | 0 | -50 | 0 | 0 |
| 25.12.2016 14:00 - 15:00 | 0 | -50 | 0 | 0 |
| 25.12.2016 15:00 - 16:00 | 0 | -50 | 0 | 0 |
| 25.12.2016 16:00 - 17:00 | 0 | -50 | 0 | 0 |
| 25.12.2016 17:00 - 18:00 | 0 | -50 | 0 | 0 |
| 25.12.2016 18:00 - 19:00 | 0 | -50 | 0 | 0 |
| 25.12.2016 19:00 - 20:00 | 0 | -50 | 0 | 0 |
| 25.12.2016 20:00 - 21:00 | 0 | -50 | 0 | 0 |
| 25.12.2016 21:00 - 22:00 | 0 | -50 | 0 | 0 |
| 25.12.2016 22:00 - 23:00 | 0 | -50 | 0 | 0 |
| 25.12.2016 23:00 - 24:00 | 0 | -150 | 0 | 0 |
| 26.12.2016 00:00 - 01:00 | 0 | -150 | 0 | 0 |
| 26.12.2016 01:00 - 02:00 | 0 | -150 | 0 | 0 |
| 26.12.2016 02:00 - 03:00 | 0 | -150 | 0 | 0 |
| 26.12.2016 03:00 - 04:00 | 0 | -150 | 0 | 0 |
| 26.12.2016 04:00 - 05:00 | 0 | -150 | 0 | 0 |
| 26.12.2016 05:00 - 06:00 | 0 | -150 | 0 | 0 |
| 26.12.2016 06:00 - 07:00 | 0 | 0 | 0 | 0 |
| 26.12.2016 07:00 - 08:00 | 0 | 0 | 0 | 0 |
| 26.12.2016 08:00 - 09:00 | 0 | 0 | 0 | 0 |
| 26.12.2016 09:00 - 10:00 | 0 | 0 | 0 | 0 |
| 26.12.2016 10:00 - 11:00 | 0 | 0 | 0 | 0 |
| 26.12.2016 11:00 - 12:00 | 0 | 0 | 0 | 0 |
| 26.12.2016 12:00 - 13:00 | 0 | 0 | 0 | 0 |
| 26.12.2016 13:00 - 14:00 | 0 | 0 | 0 | 0 |
| 26.12.2016 14:00 - 15:00 | 0 | 0 | 0 | 0 |
| 26.12.2016 15:00 - 16:00 | 0 | 0 | 0 | 0 |
| 26.12.2016 16:00 - 17:00 | 0 | 0 | 0 | 0 |
| 26.12.2016 17:00 - 18:00 | 0 | 0 | 0 | 0 |
| 26.12.2016 18:00 - 19:00 | 0 | 0 | 0 | 0 |
| 26.12.2016 19:00 - 20:00 | 0 | 0 | 0 | 0 |
| 26.12.2016 20:00 - 21:00 | 0 | 0 | 0 | 0 |
| 26.12.2016 21:00 - 22:00 | 0 | 0 | 0 | 0 |
| 26.12.2016 22:00 - 23:00 | 0 | 0 | 0 | 0 |
| 26.12.2016 23:00 - 24:00 | 0 | 0 | 0 | 0 |
| 27.12.2016 00:00 - 01:00 | 0 | 0 | 0 | 0 |
| 27.12.2016 01:00 - 02:00 | 0 | 0 | 0 | 0 |
| 27.12.2016 02:00 - 03:00 | 0 | 0 | 0 | 0 |
| 27.12.2016 03:00 - 04:00 | 0 | -80 | 0 | 0 |
| 27.12.2016 04:00 - 05:00 | 0 | -80 | 0 | 0 |
| 27.12.2016 05:00 - 06:00 | 0 | -80 | 0 | 0 |
| 27.12.2016 06:00 - 07:00 | 0 | 0 | 0 | 0 |
| 27.12.2016 07:00 - 08:00 | 0 | 0 | 0 | 0 |
| 27.12.2016 08:00 - 09:00 | 0 | 0 | 0 | 0 |
| 27.12.2016 09:00 - 10:00 | 0 | 0 | 0 | 0 |
| 27.12.2016 10:00 - 11:00 | 0 | 0 | 0 | 0 |
| 27.12.2016 11:00 - 12:00 | 0 | 0 | 0 | 0 |
| 27.12.2016 12:00 - 13:00 | 0 | 0 | 0 | 0 |
| 27.12.2016 12:00 - 13:00 | 0 | 0 | 0 | 0 |
| 27.12.2016 13:00 - 14:00 | 0 | 0 | 0 | 0 |
| 27.12.2016 14:00 - 15:00 | 0 | 0 | 0 | 0 |
| 27.12.2016 15:00 - 16:00 | 0 | 0 | 0 | 0 |
| 27.12.2016 16:00 - 17:00 | 0 | 0 | 0 | 0 |
| 27.12.2016 17:00 - 18:00 | 0 | 0 | 0 | 0 |
| 27.12.2016 18:00 - 19:00 | 0 | 0 | 0 | 0 |
| 27.12.2016 19:00 - 20:00 | 0 | 0 | 0 | 0 |
| 27.12.2016 20:00 - 21:00 | 0 | 0 | 0 | 0 |
| 27.12.2016 21:00 - 22:00 | 0 | 0 | 0 | 0 |
| 27.12.2016 22:00 - 23:00 | 0 | 0 | 0 | 0 |
| 27.12.2016 23:00 - 24:00 | 0 | 0 | 0 | 0 |
| 28.12.2016 00:00 - 01:00 | 0 | 0 | 0 | 0 |
| 28.12.2016 01:00 - 02:00 | 0 | 0 | 0 | 0 |
| 28.12.2016 02:00 - 03:00 | 0 | 0 | 0 | 0 |
| 28.12.2016 03:00 - 04:00 | 0 | 0 | 0 | 0 |
| 28.12.2016 04:00 - 05:00 | 0 | 0 | 0 | 0 |
| 28.12.2016 05:00 - 06:00 | 0 | 0 | 0 | 0 |
| 28.12.2016 06:00 - 07:00 | 50 | 0 | 0 | 0 |
| 28.12.2016 07:00 - 08:00 | 50 | 0 | 0 | 0 |
| 28.12.2016 08:00 - 09:00 | 50 | 0 | 0 | 0 |
| 28.12.2016 09:00 - 10:00 | 50 | 0 | 0 | 0 |
| 28.12.2016 10:00 - 11:00 | 50 | 0 | 0 | 0 |
| 28.12.2016 11:00 - 12:00 | 50 | 0 | 0 | 0 |
| 28.12.2016 12:00 - 13:00 | 50 | 0 | 0 | 0 |
| 28.12.2016 13:00 - 14:00 | 50 | 0 | 0 | 0 |
| 28.12.2016 14:00 - 15:00 | 50 | 0 | 0 | 0 |
| 28.12.2016 15:00 - 16:00 | 50 | 0 | 0 | 0 |
| 28.12.2016 16:00 - 17:00 | 50 | 0 | 0 | 0 |
| 28.12.2016 17:00 - 18:00 | 50 | 0 | 0 | 0 |
| 28.12.2016 18:00 - 19:00 | 50 | 0 | 0 | 0 |
| 28.12.2016 19:00 - 20:00 | 50 | 0 | 0 | 0 |
| 28.12.2016 20:00 - 21:00 | 50 | 0 | 0 | 0 |
| 28.12.2016 21:00 - 22:00 | 50 | 0 | 0 | 0 |
| 28.12.2016 22:00 - 23:00 | 50 | 0 | 0 | 0 |
| 28.12.2016 23:00 - 24:00 | 50 | -50 | 0 | 0 |
| 29.12.2016 00:00 - 01:00 | 50 | -50 | 0 | 0 |
| 29.12.2016 01:00 - 02:00 | 50 | -50 | 0 | 0 |
| 29.12.2016 02:00 - 03:00 | 50 | -50 | 0 | 0 |
| 29.12.2016 03:00 - 04:00 | 50 | -50 | 0 | 0 |
| 29.12.2016 04:00 - 05:00 | 50 | -50 | 0 | 0 |
| 29.12.2016 05:00 - 06:00 | 50 | 0 | 0 | 0 |
| 29.12.2016 06:00 - 07:00 | 0 | 0 | 0 | 0 |
| 29.12.2016 07:00 - 08:00 | 0 | 0 | 0 | 0 |
| 29.12.2016 08:00 - 09:00 | 0 | 0 | 0 | 0 |
| 29.12.2016 09:00 - 10:00 | 0 | 0 | 0 | 0 |
| 29.12.2016 10:00 - 11:00 | 0 | 0 | 0 | 0 |
| 29.12.2016 11:00 - 12:00 | 40 | 0 | 0 | 0 |
| 29.12.2016 12:00 - 13:00 | 40 | 0 | 0 | 0 |
| 29.12.2016 13:00 - 14:00 | 70 | 0 | 0 | 0 |
| 29.12.2016 14:00 - 15:00 | 70 | 0 | 0 | 0 |
| 29.12.2016 15:00 - 16:00 | 70 | 0 | 0 | 0 |
| 29.12.2016 16:00 - 17:00 | 70 | 0 | 0 | 0 |
| 29.12.2016 17:00 - 18:00 | 70 | 0 | 0 | 0 |
| 29.12.2016 18:00 - 19:00 | 70 | 0 | 0 | 0 |
| 29.12.2016 19:00 - 20:00 | 70 | 0 | 0 | 0 |
| 29.12.2016 20:00 - 21:00 | 70 | 0 | 0 | 0 |
| 29.12.2016 21:00 - 22:00 | 70 | 0 | 0 | 0 |
| 29.12.2016 22:00 - 23:00 | 70 | 0 | 0 | 0 |
| 29.12.2016 23:00 - 24:00 | 70 | -50 | 0 | 0 |
| 30.12.2016 00:00 - 01:00 | 70 | -50 | 0 | 0 |
| 30.12.2016 01:00 - 02:00 | 70 | -50 | 0 | 0 |
| 30.12.2016 02:00 - 03:00 | 70 | -50 | 0 | 0 |
| 30.12.2016 03:00 - 04:00 | 70 | -50 | 0 | 0 |
| 30.12.2016 04:00 - 05:00 | 70 | -50 | 0 | 0 |
| 30.12.2016 05:00 - 06:00 | 70 | 0 | 0 | 0 |
| 30.12.2016 06:00 - 07:00 | 30 | 0 | 0 | 0 |
| 30.12.2016 07:00 - 08:00 | 30 | 0 | 0 | 0 |
| 30.12.2016 08:00 - 09:00 | 30 | 0 | 0 | 0 |
| 30.12.2016 09:00 - 10:00 | 30 | 0 | 0 | 0 |
| 30.12.2016 10:00 - 11:00 | 30 | 0 | 0 | 0 |
| 30.12.2016 11:00 - 12:00 | 30 | 0 | 0 | 0 |
| 30.12.2016 12:00 - 13:00 | 30 | 0 | 0 | 0 |
| 30.12.2016 13:00 - 14:00 | 30 | 0 | 0 | 0 |
| 30.12.2016 14:00 - 15:00 | 30 | 0 | 0 | 0 |
| 30.12.2016 15:00 - 16:00 | 30 | 0 | 0 | 0 |
| 30.12.2016 16:00 - 17:00 | 30 | 0 | 0 | 0 |
| 30.12.2016 17:00 - 18:00 | 30 | 0 | 0 | 0 |
| 30.12.2016 18:00 - 19:00 | 30 | 0 | 0 | 0 |
| 30.12.2016 19:00 - 20:00 | 30 | 0 | 0 | 0 |
| 30.12.2016 20:00 - 21:00 | 30 | 0 | 0 | 0 |
| 30.12.2016 21:00 - 22:00 | 30 | 0 | 0 | 0 |
| 30.12.2016 22:00 - 23:00 | 30 | 0 | 0 | 0 |
| 30.12.2016 23:00 - 24:00 | 30 | 0 | 0 | 0 |
| 31.12.2016 00:00 - 01:00 | 30 | 0 | 0 | 0 |
| 31.12.2016 01:00 - 02:00 | 30 | 0 | 0 | 0 |
| 31.12.2016 02:00 - 03:00 | 30 | 0 | 0 | 0 |
| 31.12.2016 03:00 - 04:00 | 30 | 0 | 0 | 0 |
| 31.12.2016 04:00 - 05:00 | 30 | 0 | 0 | 0 |
| 31.12.2016 05:00 - 06:00 | 30 | 0 | 0 | 0 |